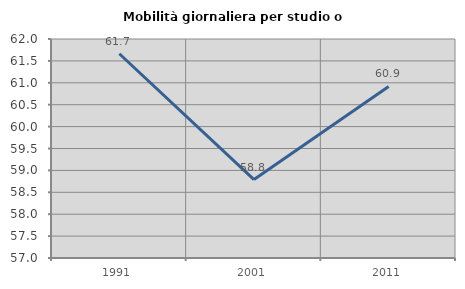
| Category | Mobilità giornaliera per studio o lavoro |
|---|---|
| 1991.0 | 61.663 |
| 2001.0 | 58.79 |
| 2011.0 | 60.917 |